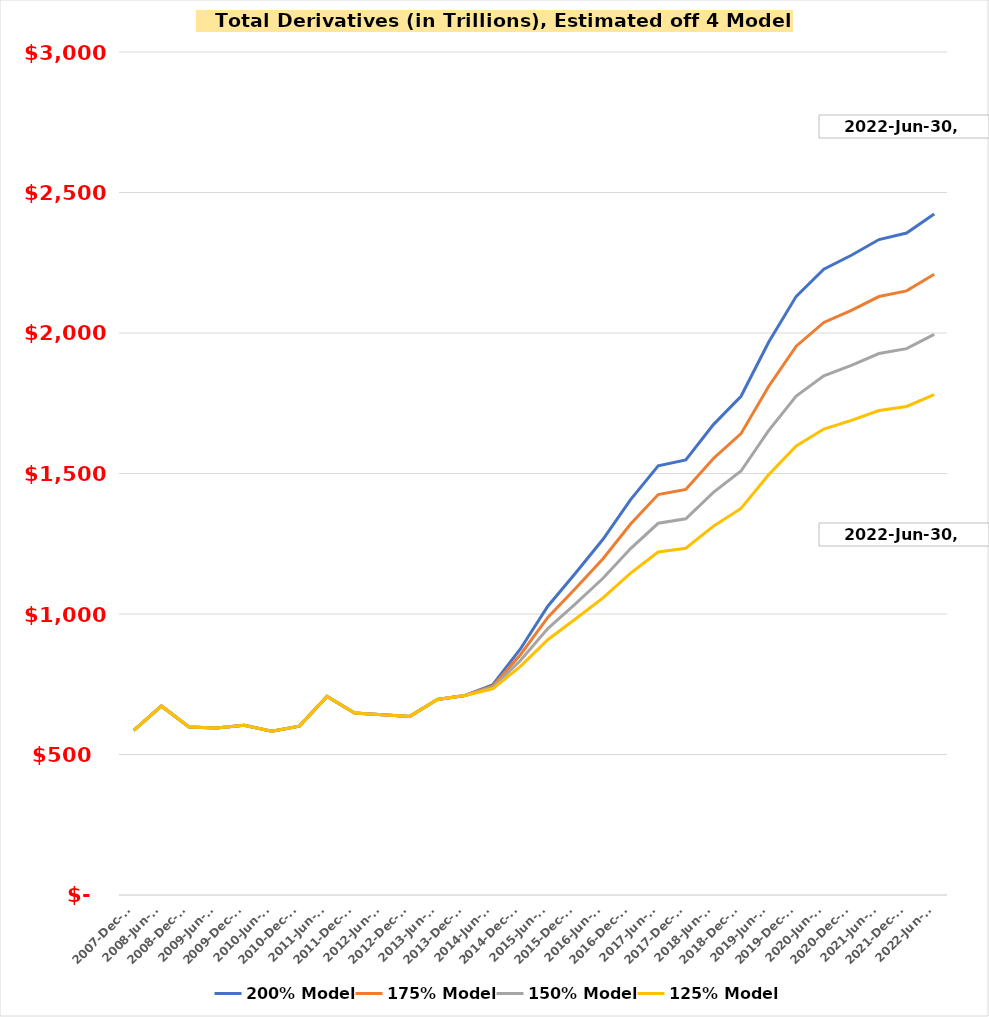
| Category | 200% Model | 175% Model | 150% Model | 125% Model |
|---|---|---|---|---|
| 2007-Dec-31 | 585.926 | 585.926 | 585.926 | 585.926 |
| 2008-Jun-30 | 672.551 | 672.551 | 672.551 | 672.551 |
| 2008-Dec-31 | 598.141 | 598.141 | 598.141 | 598.141 |
| 2009-Jun-30 | 594.546 | 594.546 | 594.546 | 594.546 |
| 2009-Dec-31 | 603.893 | 603.893 | 603.893 | 603.893 |
| 2010-Jun-30 | 582.681 | 582.681 | 582.681 | 582.681 |
| 2010-Dec-31 | 601.043 | 601.043 | 601.043 | 601.043 |
| 2011-Jun-30 | 706.879 | 706.879 | 706.879 | 706.879 |
| 2011-Dec-31 | 647.807 | 647.807 | 647.807 | 647.807 |
| 2012-Jun-30 | 641.305 | 641.305 | 641.305 | 641.305 |
| 2012-Dec-31 | 635.681 | 635.681 | 635.681 | 635.681 |
| 2013-Jun-30 | 695.879 | 695.879 | 695.879 | 695.879 |
| 2013-Dec-31 | 710.092 | 710.092 | 710.092 | 710.092 |
| 2014-Jun-30 | 748.048 | 743.304 | 738.559 | 733.815 |
| 2014-Dec-31 | 874.705 | 854.128 | 833.552 | 812.975 |
| 2015-Jun-30 | 1027.681 | 987.983 | 948.284 | 908.585 |
| 2015-Dec-31 | 1145.205 | 1090.816 | 1036.427 | 982.038 |
| 2016-Jun-30 | 1266.018 | 1196.527 | 1127.036 | 1057.546 |
| 2016-Dec-31 | 1407.061 | 1319.94 | 1232.819 | 1145.698 |
| 2017-Jun-30 | 1527.096 | 1424.971 | 1322.845 | 1220.72 |
| 2017-Dec-31 | 1548.152 | 1443.394 | 1338.637 | 1233.879 |
| 2018-Jun-30 | 1673.993 | 1553.506 | 1433.018 | 1312.53 |
| 2018-Dec-31 | 1774.891 | 1641.791 | 1508.691 | 1375.591 |
| 2019-Jun-30 | 1966.829 | 1809.737 | 1652.645 | 1495.553 |
| 2019-Dec-31 | 2130.508 | 1952.956 | 1775.404 | 1597.852 |
| 2020-Jun-30 | 2227.124 | 2037.495 | 1847.866 | 1658.237 |
| 2020-Dec-31 | 2276.655 | 2080.835 | 1885.014 | 1689.194 |
| 2021-Jun-30 | 2332.536 | 2129.731 | 1926.925 | 1724.12 |
| 2021-Dec-31 | 2355.696 | 2149.996 | 1944.295 | 1738.595 |
| 2022-Jun-30 | 2423.341 | 2209.185 | 1995.029 | 1780.873 |